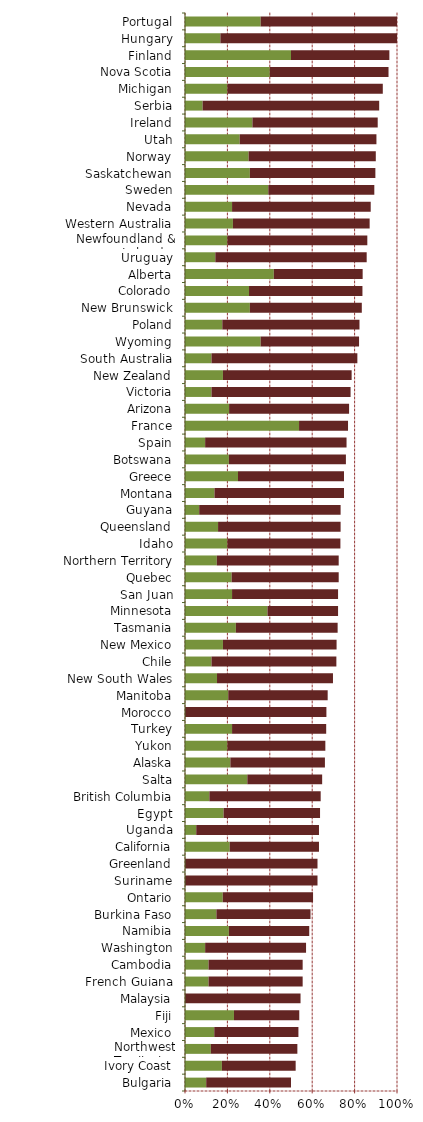
| Category |   Encourages Investment |   Not a Deterrent to Investment |
|---|---|---|
| Bulgaria | 0.1 | 0.4 |
| Ivory Coast | 0.174 | 0.348 |
| Northwest Territories | 0.122 | 0.408 |
| Mexico | 0.138 | 0.397 |
| Fiji | 0.231 | 0.308 |
| Malaysia | 0 | 0.545 |
| French Guiana | 0.111 | 0.444 |
| Cambodia | 0.111 | 0.444 |
| Washington | 0.095 | 0.476 |
| Namibia | 0.207 | 0.379 |
| Burkina Faso | 0.148 | 0.444 |
| Ontario | 0.178 | 0.426 |
| Suriname | 0 | 0.625 |
| Greenland | 0 | 0.625 |
| California | 0.211 | 0.421 |
| Uganda | 0.053 | 0.579 |
| Egypt | 0.182 | 0.455 |
| British Columbia | 0.115 | 0.525 |
| Salta | 0.294 | 0.353 |
| Alaska | 0.214 | 0.446 |
| Yukon | 0.2 | 0.462 |
| Turkey | 0.222 | 0.444 |
| Morocco | 0 | 0.667 |
| Manitoba | 0.204 | 0.469 |
| New South Wales | 0.151 | 0.547 |
| Chile | 0.125 | 0.589 |
| New Mexico | 0.179 | 0.536 |
| Tasmania | 0.24 | 0.48 |
| Minnesota | 0.389 | 0.333 |
| San Juan | 0.222 | 0.5 |
| Quebec | 0.22 | 0.505 |
| Northern Territory | 0.15 | 0.575 |
| Idaho | 0.2 | 0.533 |
| Queensland | 0.156 | 0.578 |
| Guyana | 0.067 | 0.667 |
| Montana | 0.139 | 0.611 |
| Greece | 0.25 | 0.5 |
| Botswana | 0.207 | 0.552 |
| Spain | 0.095 | 0.667 |
| France | 0.538 | 0.231 |
| Arizona | 0.208 | 0.566 |
| Victoria | 0.125 | 0.656 |
| New Zealand | 0.179 | 0.607 |
| South Australia | 0.125 | 0.688 |
| Wyoming | 0.357 | 0.464 |
| Poland | 0.176 | 0.647 |
| New Brunswick | 0.306 | 0.528 |
| Colorado | 0.302 | 0.535 |
| Alberta | 0.419 | 0.419 |
| Uruguay | 0.143 | 0.714 |
| Newfoundland & Labrador | 0.2 | 0.66 |
| Western Australia | 0.226 | 0.645 |
| Nevada | 0.222 | 0.654 |
| Sweden | 0.393 | 0.5 |
| Saskatchewan | 0.306 | 0.592 |
| Norway | 0.3 | 0.6 |
| Utah | 0.258 | 0.645 |
| Ireland | 0.318 | 0.591 |
| Serbia | 0.083 | 0.833 |
| Michigan | 0.2 | 0.733 |
| Nova Scotia | 0.4 | 0.56 |
| Finland | 0.5 | 0.464 |
| Hungary | 0.167 | 0.833 |
| Portugal | 0.357 | 0.643 |